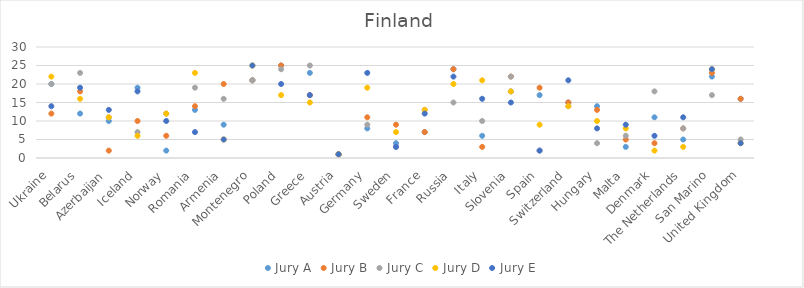
| Category | Jury A | Jury B | Jury C | Jury D | Jury E |
|---|---|---|---|---|---|
| Ukraine | 20 | 12 | 20 | 22 | 14 |
| Belarus | 12 | 18 | 23 | 16 | 19 |
| Azerbaijan | 10 | 2 | 11 | 11 | 13 |
| Iceland | 19 | 10 | 7 | 6 | 18 |
| Norway | 2 | 6 | 12 | 12 | 10 |
| Romania | 13 | 14 | 19 | 23 | 7 |
| Armenia | 9 | 20 | 16 | 5 | 5 |
| Montenegro | 21 | 21 | 21 | 25 | 25 |
| Poland | 25 | 25 | 24 | 17 | 20 |
| Greece | 23 | 17 | 25 | 15 | 17 |
| Austria | 1 | 1 | 1 | 1 | 1 |
| Germany | 8 | 11 | 9 | 19 | 23 |
| Sweden | 4 | 9 | 3 | 7 | 3 |
| France | 7 | 7 | 13 | 13 | 12 |
| Russia | 24 | 24 | 15 | 20 | 22 |
| Italy | 6 | 3 | 10 | 21 | 16 |
| Slovenia | 18 | 22 | 22 | 18 | 15 |
| Spain | 17 | 19 | 2 | 9 | 2 |
| Switzerland | 15 | 15 | 14 | 14 | 21 |
| Hungary | 14 | 13 | 4 | 10 | 8 |
| Malta | 3 | 5 | 6 | 8 | 9 |
| Denmark | 11 | 4 | 18 | 2 | 6 |
| The Netherlands | 5 | 8 | 8 | 3 | 11 |
| San Marino | 22 | 23 | 17 | 24 | 24 |
| United Kingdom | 16 | 16 | 5 | 4 | 4 |